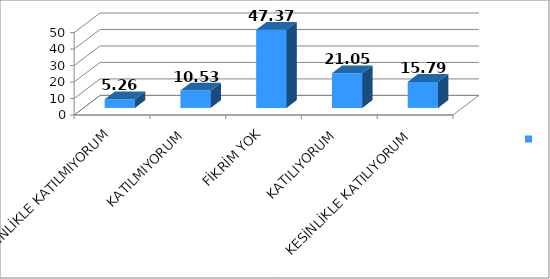
| Category | Series 0 |
|---|---|
| KESİNLİKLE KATILMIYORUM | 5.26 |
| KATILMIYORUM | 10.53 |
| FİKRİM YOK | 47.37 |
| KATILIYORUM | 21.05 |
| KESİNLİKLE KATILIYORUM | 15.79 |